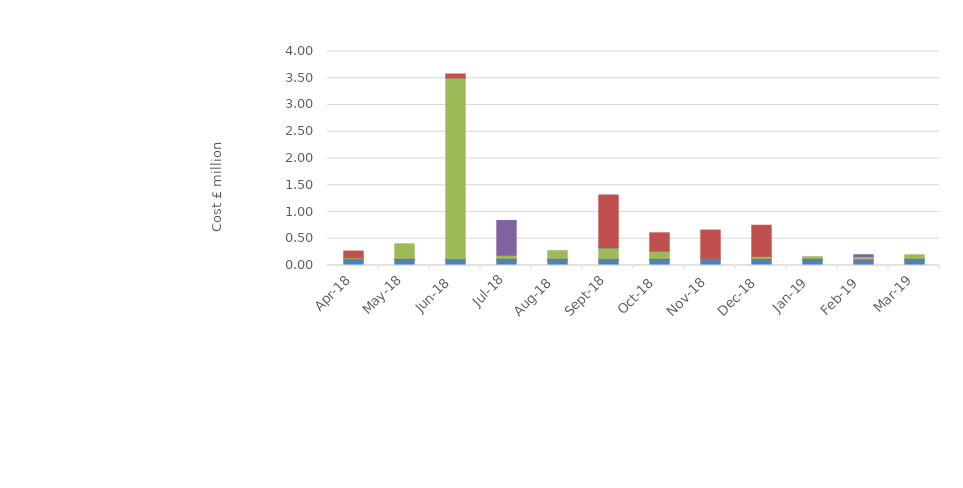
| Category | AS - BM Intertrip capability (Mandatory - CAP76) | AS - BM Intertrip capability  (Commercial) | AS - BM Intertrip Arming  (Commercial) | AS - Interconnector Intertrip Arming (Commercial) | AS - BM Intertrip - trip (Mandatory and Commercial) | AS - BM Constraints |
|---|---|---|---|---|---|---|
| 2018-04-01 | 0.112 | 0.016 | 0.016 | 0 | 0 | 0.125 |
| 2018-05-01 | 0.116 | 0.017 | 0.272 | 0 | 0 | 0 |
| 2018-06-01 | 0.112 | 0.016 | 3.377 | 0 | 0 | 0.075 |
| 2018-07-01 | 0.116 | 0.017 | 0.061 | 0.649 | 0 | 0 |
| 2018-08-01 | 0.116 | 0.017 | 0.144 | 0 | 0 | 0 |
| 2018-09-01 | 0.112 | 0.016 | 0.2 | 0.01 | 0 | 0.978 |
| 2018-10-01 | 0.116 | 0.017 | 0.136 | 0 | 0 | 0.342 |
| 2018-11-01 | 0.112 | 0.016 | 0.005 | 0 | 0 | 0.528 |
| 2018-12-01 | 0.116 | 0.017 | 0.039 | 0 | 0 | 0.582 |
| 2019-01-01 | 0.116 | 0.017 | 0.031 | 0 | 0 | 0 |
| 2019-02-01 | 0.105 | 0.015 | 0.049 | 0.033 | 0 | 0 |
| 2019-03-01 | 0.116 | 0.017 | 0.067 | 0 | 0 | 0 |